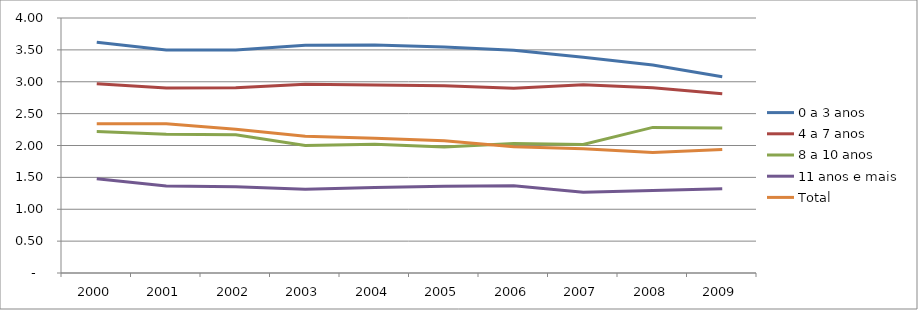
| Category | 0 a 3 anos | 4 a 7 anos | 8 a 10 anos | 11 anos e mais | Total |
|---|---|---|---|---|---|
| 2000.0 | 3.62 | 2.97 | 2.22 | 1.48 | 2.34 |
| 2001.0 | 3.498 | 2.903 | 2.177 | 1.364 | 2.342 |
| 2002.0 | 3.497 | 2.908 | 2.17 | 1.353 | 2.255 |
| 2003.0 | 3.574 | 2.961 | 1.999 | 1.314 | 2.145 |
| 2004.0 | 3.575 | 2.95 | 2.021 | 1.341 | 2.115 |
| 2005.0 | 3.543 | 2.938 | 1.977 | 1.36 | 2.073 |
| 2006.0 | 3.493 | 2.898 | 2.03 | 1.369 | 1.979 |
| 2007.0 | 3.383 | 2.954 | 2.017 | 1.265 | 1.947 |
| 2008.0 | 3.263 | 2.905 | 2.284 | 1.293 | 1.889 |
| 2009.0 | 3.079 | 2.813 | 2.276 | 1.321 | 1.936 |